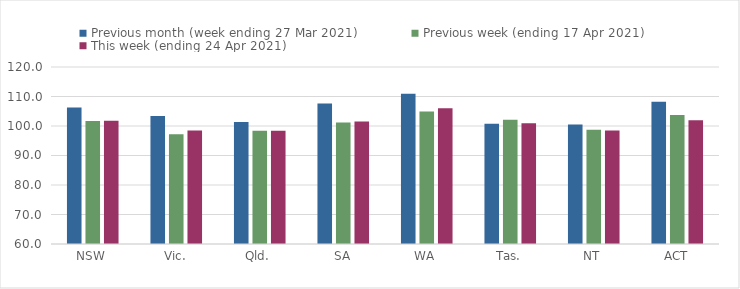
| Category | Previous month (week ending 27 Mar 2021) | Previous week (ending 17 Apr 2021) | This week (ending 24 Apr 2021) |
|---|---|---|---|
| NSW | 106.3 | 101.7 | 101.75 |
| Vic. | 103.39 | 97.22 | 98.5 |
| Qld. | 101.33 | 98.39 | 98.4 |
| SA | 107.6 | 101.15 | 101.52 |
| WA | 110.93 | 104.94 | 106.02 |
| Tas. | 100.75 | 102.09 | 100.95 |
| NT | 100.52 | 98.72 | 98.47 |
| ACT | 108.24 | 103.74 | 101.97 |